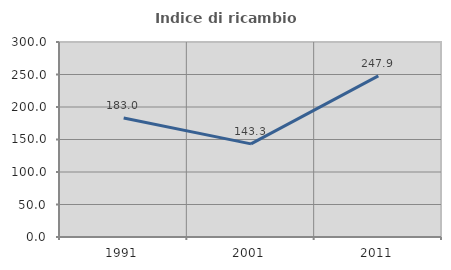
| Category | Indice di ricambio occupazionale  |
|---|---|
| 1991.0 | 183.036 |
| 2001.0 | 143.307 |
| 2011.0 | 247.872 |